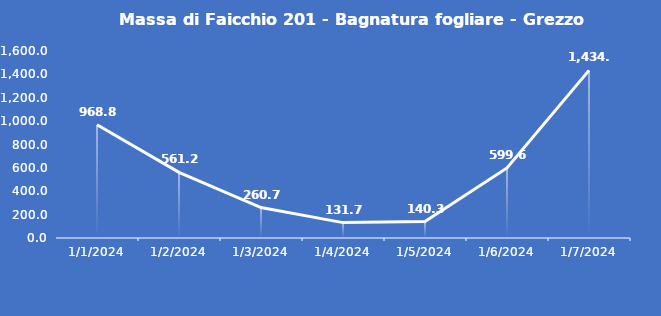
| Category | Massa di Faicchio 201 - Bagnatura fogliare - Grezzo (min) |
|---|---|
| 1/1/24 | 968.8 |
| 1/2/24 | 561.2 |
| 1/3/24 | 260.7 |
| 1/4/24 | 131.7 |
| 1/5/24 | 140.3 |
| 1/6/24 | 599.6 |
| 1/7/24 | 1434.5 |